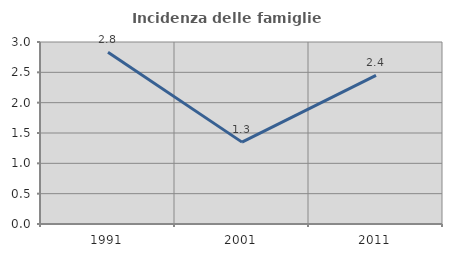
| Category | Incidenza delle famiglie numerose |
|---|---|
| 1991.0 | 2.832 |
| 2001.0 | 1.35 |
| 2011.0 | 2.449 |